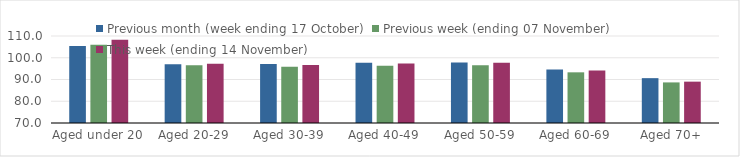
| Category | Previous month (week ending 17 October) | Previous week (ending 07 November) | This week (ending 14 November) |
|---|---|---|---|
| Aged under 20 | 105.38 | 106 | 108.25 |
| Aged 20-29 | 97.04 | 96.53 | 97.21 |
| Aged 30-39 | 97.09 | 95.82 | 96.63 |
| Aged 40-49 | 97.65 | 96.37 | 97.41 |
| Aged 50-59 | 97.83 | 96.59 | 97.69 |
| Aged 60-69 | 94.65 | 93.3 | 94.11 |
| Aged 70+ | 90.62 | 88.66 | 89.01 |